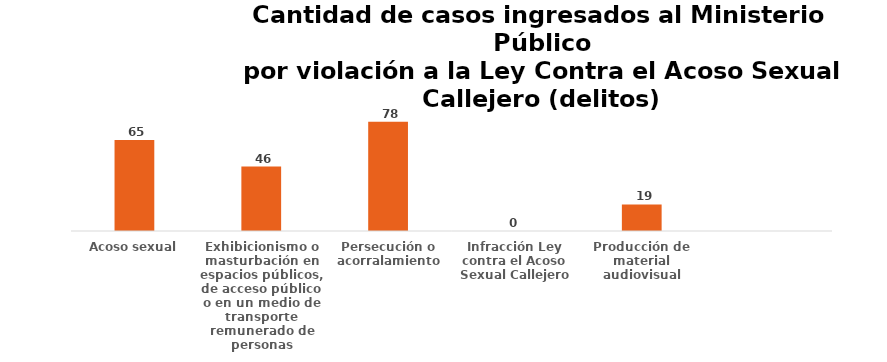
| Category | Series 0 |
|---|---|
| Acoso sexual | 65 |
| Exhibicionismo o masturbación en espacios públicos, de acceso público o en un medio de transporte remunerado de personas | 46 |
| Persecución o acorralamiento | 78 |
| Infracción Ley contra el Acoso Sexual Callejero | 0 |
| Producción de material audiovisual | 19 |